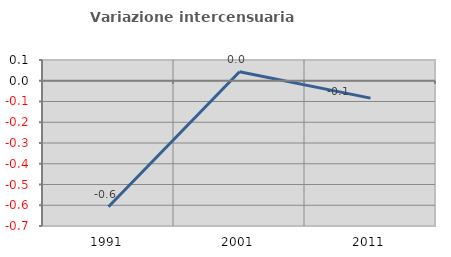
| Category | Variazione intercensuaria annua |
|---|---|
| 1991.0 | -0.607 |
| 2001.0 | 0.043 |
| 2011.0 | -0.084 |